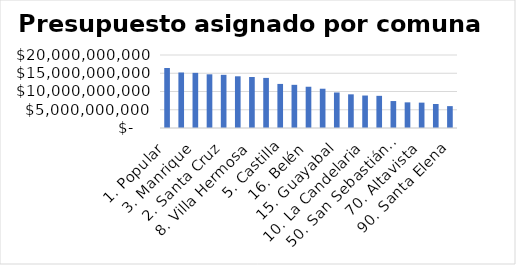
| Category | Presupuesto Participativo 2021 |
|---|---|
| 1. Popular | 16435738982 |
| 6. Doce de Octubre | 15207140415 |
| 3. Manrique | 15109742551 |
| 7. Robledo | 14709000349 |
| 2. Santa Cruz | 14566251883 |
| 13. San Javier | 14165805569 |
| 8. Villa Hermosa | 13980188162 |
| 4. Aranjuez | 13723958233 |
| 5. Castilla | 12074571967 |
| 9. Buenos Aires | 11827266561 |
| 16. Belén | 11302498074 |
| 80. San Antonio de Prado | 10759996901 |
| 15. Guayabal | 9729057810 |
| 60. San Cristobal | 9225271899 |
| 10. La Candelaria | 8896857688 |
| 12. La América | 8812724993 |
| 50. San Sebastián de Palmitas | 7383763937 |
| 11. Laureles Estadio | 7025104089 |
| 70. Altavista | 6950790911 |
| 14. Poblado | 6570822458 |
| 90. Santa Elena | 5992784302 |